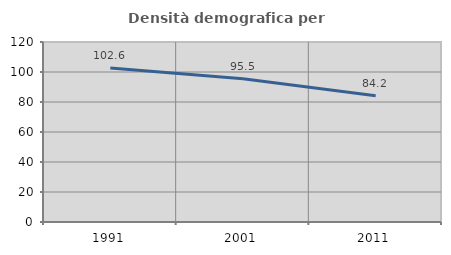
| Category | Densità demografica |
|---|---|
| 1991.0 | 102.645 |
| 2001.0 | 95.479 |
| 2011.0 | 84.171 |